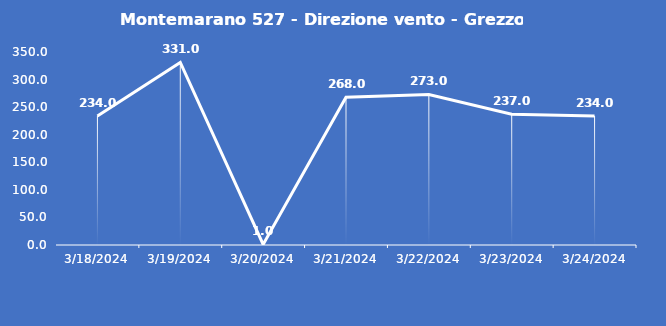
| Category | Montemarano 527 - Direzione vento - Grezzo (°N) |
|---|---|
| 3/18/24 | 234 |
| 3/19/24 | 331 |
| 3/20/24 | 1 |
| 3/21/24 | 268 |
| 3/22/24 | 273 |
| 3/23/24 | 237 |
| 3/24/24 | 234 |